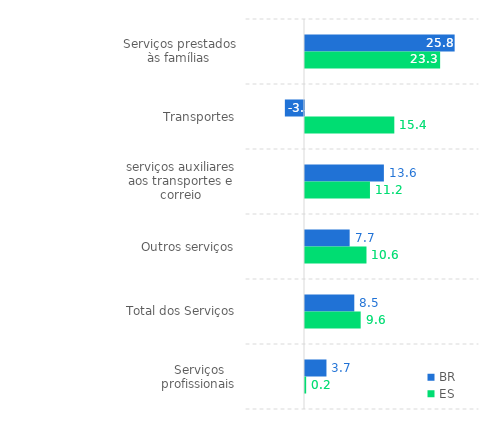
| Category | BR | ES |
|---|---|---|
| 0 | 25.8 | 23.3 |
| 1 | -3.3 | 15.4 |
| 2 | 13.6 | 11.2 |
| 3 | 7.7 | 10.6 |
| 4 | 8.5 | 9.6 |
| 5 | 3.7 | 0.2 |